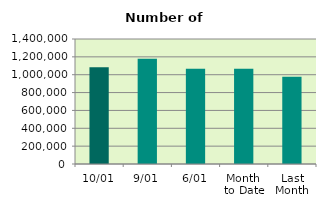
| Category | Series 0 |
|---|---|
| 10/01 | 1083842 |
| 9/01 | 1179574 |
| 6/01 | 1066858 |
| Month 
to Date | 1066590.286 |
| Last
Month | 976608.095 |